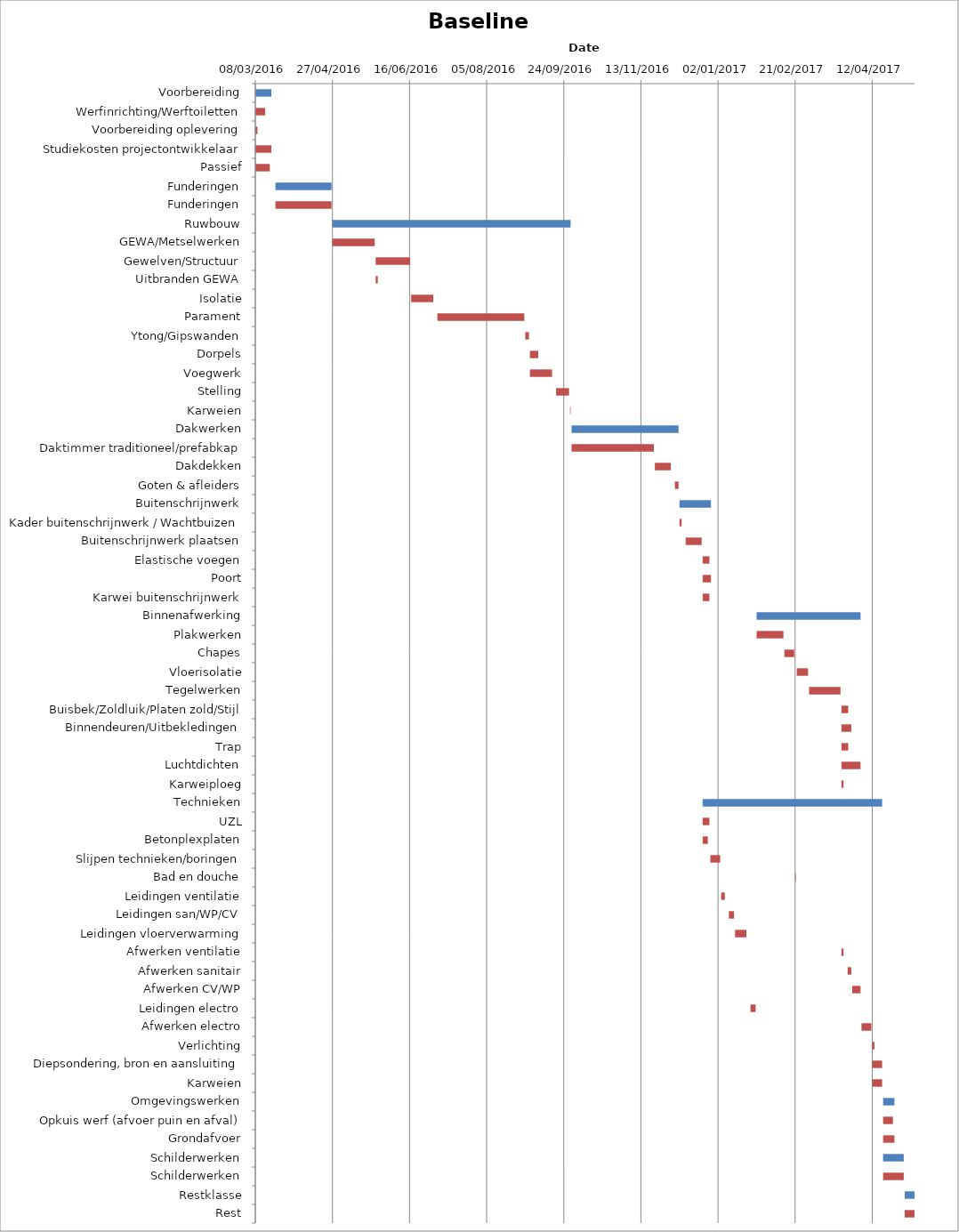
| Category | Baseline start | Actual duration |
|---|---|---|
| Voorbereiding | 42437.333 | 10.375 |
| Werfinrichting/Werftoiletten | 42437.333 | 6.375 |
| Voorbereiding oplevering | 42437.333 | 1.375 |
| Studiekosten projectontwikkelaar | 42437.333 | 10.375 |
| Passief | 42437.333 | 9.375 |
| Funderingen | 42450.333 | 36.375 |
| Funderingen | 42450.333 | 36.375 |
| Ruwbouw | 42487.333 | 154.375 |
| GEWA/Metselwerken | 42487.333 | 27.375 |
| Gewelven/Structuur | 42515.333 | 22.375 |
| Uitbranden GEWA | 42515.333 | 1.375 |
| Isolatie | 42538.333 | 14.375 |
| Parament | 42555.333 | 56.375 |
| Ytong/Gipswanden | 42612.333 | 2.375 |
| Dorpels | 42615.333 | 5.375 |
| Voegwerk | 42615.333 | 14.375 |
| Stelling | 42632.333 | 8.375 |
| Karweien | 42641.333 | 0.375 |
| Dakwerken | 42642.333 | 69.375 |
| Daktimmer traditioneel/prefabkap | 42642.333 | 53.375 |
| Dakdekken | 42696.333 | 10.375 |
| Goten & afleiders | 42709.333 | 2.375 |
| Buitenschrijnwerk | 42712.333 | 20.375 |
| Kader buitenschrijnwerk / Wachtbuizen | 42712.333 | 1.375 |
| Buitenschrijnwerk plaatsen | 42716.333 | 10.375 |
| Elastische voegen | 42727.333 | 4.375 |
| Poort | 42727.333 | 5.375 |
| Karwei buitenschrijnwerk | 42727.333 | 4.375 |
| Binnenafwerking | 42762.333 | 67.375 |
| Plakwerken | 42762.333 | 17.375 |
| Chapes | 42780.333 | 6.375 |
| Vloerisolatie | 42788.333 | 7.375 |
| Tegelwerken | 42796.333 | 20.375 |
| Buisbek/Zoldluik/Platen zold/Stijl | 42817.333 | 4.375 |
| Binnendeuren/Uitbekledingen | 42817.333 | 6.375 |
| Trap | 42817.333 | 4.375 |
| Luchtdichten | 42817.333 | 12.375 |
| Karweiploeg | 42817.333 | 1.375 |
| Technieken | 42727.333 | 116.375 |
| UZL | 42727.333 | 4.375 |
| Betonplexplaten | 42727.333 | 3.375 |
| Slijpen technieken/boringen | 42732.333 | 6.375 |
| Bad en douche | 42787.333 | 0.375 |
| Leidingen ventilatie | 42739.333 | 2.375 |
| Leidingen san/WP/CV | 42744.333 | 3.375 |
| Leidingen vloerverwarming | 42748.333 | 7.375 |
| Afwerken ventilatie | 42817.333 | 1.375 |
| Afwerken sanitair | 42821.333 | 2.375 |
| Afwerken CV/WP | 42824.333 | 5.375 |
| Leidingen electro | 42758.333 | 3.375 |
| Afwerken electro | 42830.333 | 6.375 |
| Verlichting | 42837.333 | 1.375 |
| Diepsondering, bron en aansluiting | 42837.333 | 6.375 |
| Karweien | 42837.333 | 6.375 |
| Omgevingswerken | 42844.333 | 7.375 |
| Opkuis werf (afvoer puin en afval) | 42844.333 | 6.375 |
| Grondafvoer | 42844.333 | 7.375 |
| Schilderwerken | 42844.333 | 13.375 |
| Schilderwerken | 42844.333 | 13.375 |
| Restklasse | 42858.333 | 6.375 |
| Rest | 42858.333 | 6.375 |